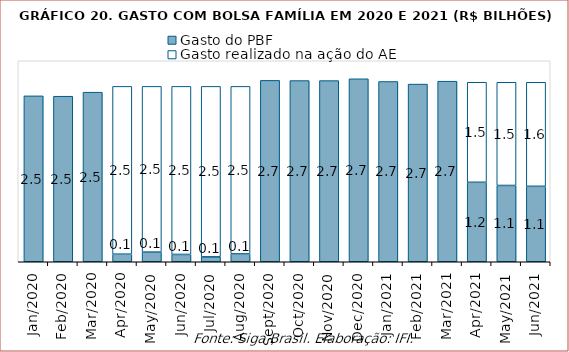
| Category | Gasto do PBF | Gasto realizado na ação do AE |
|---|---|---|
| 2020-01-01 | 2.476 | 0 |
| 2020-02-01 | 2.471 | 0 |
| 2020-03-01 | 2.531 | 0 |
| 2020-04-01 | 0.113 | 2.505 |
| 2020-05-01 | 0.144 | 2.474 |
| 2020-06-01 | 0.109 | 2.508 |
| 2020-07-01 | 0.073 | 2.545 |
| 2020-08-01 | 0.117 | 2.5 |
| 2020-09-01 | 2.707 | 0 |
| 2020-10-01 | 2.704 | 0 |
| 2020-11-01 | 2.704 | 0 |
| 2020-12-01 | 2.731 | 0 |
| 2021-01-01 | 2.691 | 0 |
| 2021-02-01 | 2.652 | 0 |
| 2021-03-01 | 2.695 | 0 |
| 2021-04-01 | 1.186 | 1.493 |
| 2021-05-01 | 1.139 | 1.54 |
| 2021-06-01 | 1.126 | 1.553 |